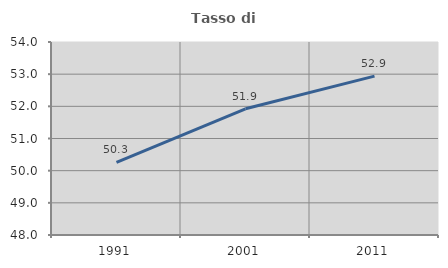
| Category | Tasso di occupazione   |
|---|---|
| 1991.0 | 50.255 |
| 2001.0 | 51.924 |
| 2011.0 | 52.939 |